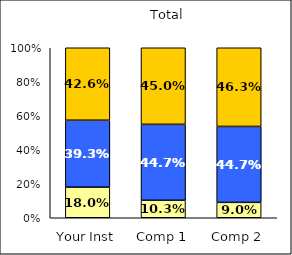
| Category | Low Faculty Interaction | Average Faculty Interaction | High Faculty Interaction |
|---|---|---|---|
| Your Inst | 0.18 | 0.393 | 0.426 |
| Comp 1 | 0.103 | 0.447 | 0.45 |
| Comp 2 | 0.09 | 0.447 | 0.463 |